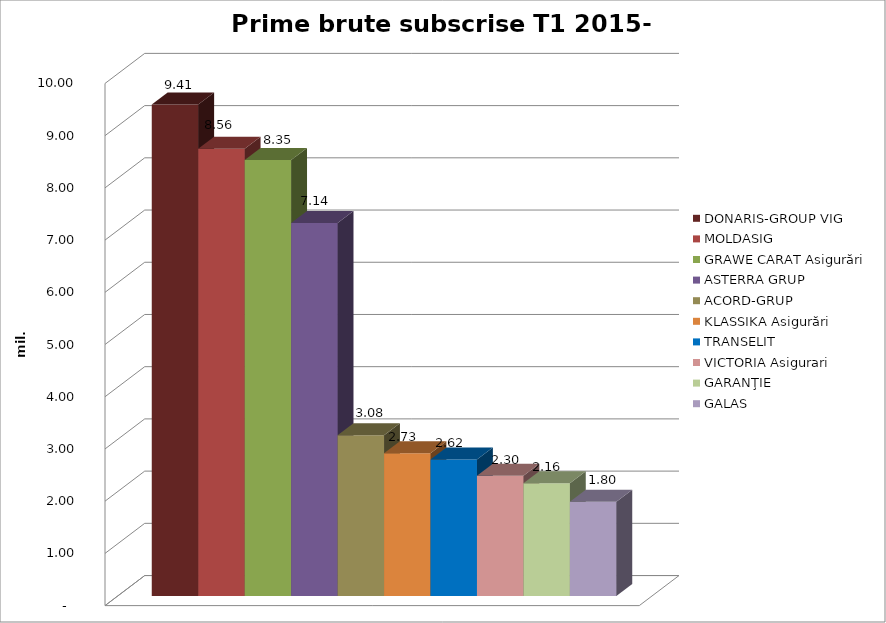
| Category | DONARIS-GROUP VIG | MOLDASIG  | GRAWE CARAT Asigurări | ASTERRA GRUP  | ACORD-GRUP  | KLASSIKA Asigurări  | TRANSELIT  | VICTORIA Asigurari  | GARANŢIE  | GALAS  |
|---|---|---|---|---|---|---|---|---|---|---|
| 0 | 9.413 | 8.565 | 8.351 | 7.144 | 3.08 | 2.735 | 2.616 | 2.301 | 2.157 | 1.804 |